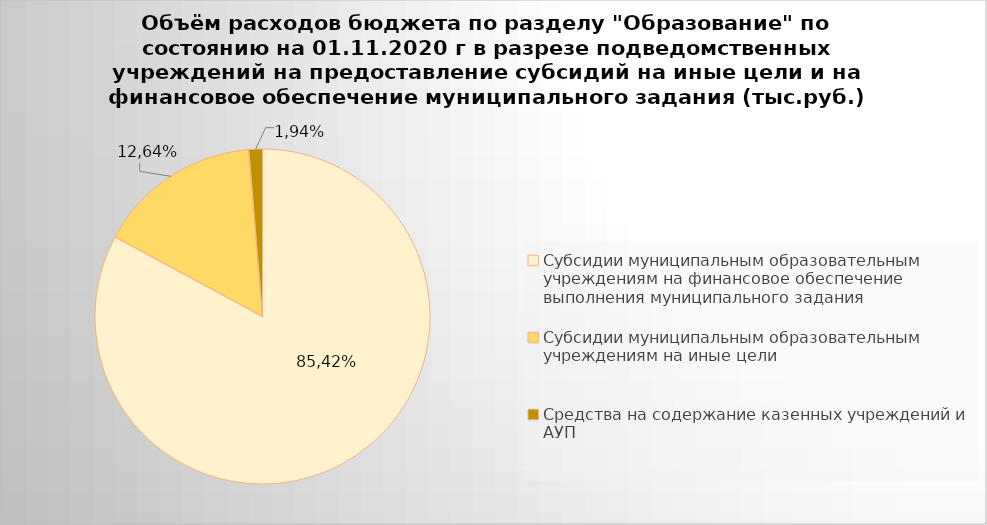
| Category | Series 0 |
|---|---|
| Субсидии муниципальным образовательным учреждениям на финансовое обеспечение выполнения муниципального задания | 5493335.84 |
| Субсидии муниципальным образовательным учреждениям на иные цели | 1048902.35 |
| Средства на содержание казенных учреждений и АУП | 86378.58 |